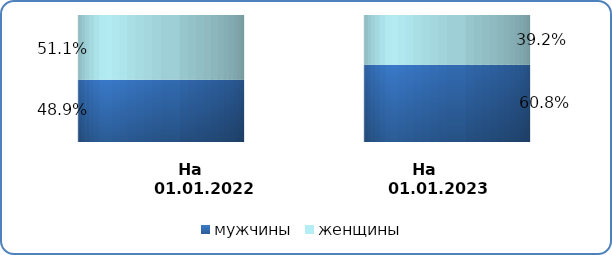
| Category | мужчины | женщины |
|---|---|---|
| на 
01.01.2022 | 0.489 | 0.511 |
| на 
01.01.2023 | 0.608 | 0.392 |